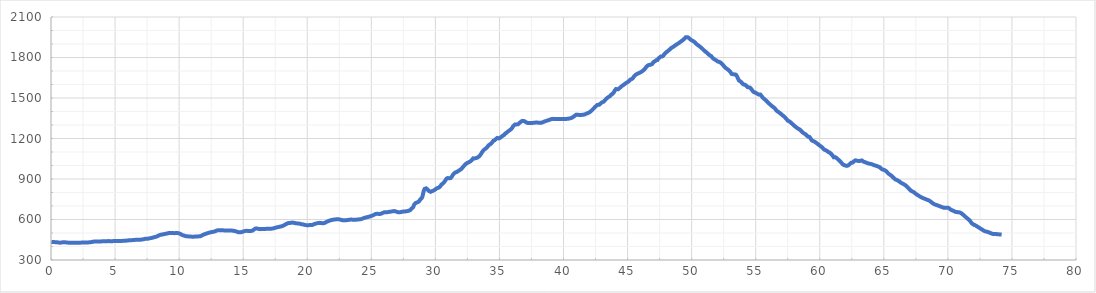
| Category | Alt[m] |
|---|---|
| 0.0 | 435 |
| 0.00437 | 434.59 |
| 0.02919 | 433.57 |
| 0.0406 | 433.1 |
| 0.0711 | 432.4 |
| 0.08312 | 432.28 |
| 0.1089 | 432 |
| 0.11001 | 432.01 |
| 0.12371 | 432.2 |
| 0.13194 | 432.32 |
| 0.15425 | 432.75 |
| 0.1646 | 432.89 |
| 0.1693 | 432.95 |
| 0.18268 | 433 |
| 0.22509 | 432.93 |
| 0.22509 | 432.93 |
| 0.39085000000000003 | 432.01 |
| 0.43028000000000005 | 431.54 |
| 0.47575000000000006 | 431 |
| 0.47575000000000006 | 431 |
| 0.55449 | 429.81 |
| 0.60117 | 429.11 |
| 0.61337 | 428.97 |
| 0.63781 | 428.77 |
| 0.72993 | 428 |
| 0.72993 | 428 |
| 0.99429 | 432.13 |
| 1.01417 | 432.44 |
| 1.04826 | 432.4 |
| 1.16982 | 430.22 |
| 1.21255 | 429.46 |
| 1.2470700000000001 | 429.02 |
| 1.4013200000000001 | 428.18 |
| 1.41809 | 428.09 |
| 1.44148 | 428.02 |
| 1.46187 | 428.01 |
| 1.47576 | 428 |
| 1.47576 | 428 |
| 1.4966899999999999 | 427.96 |
| 1.6485999999999998 | 427.64 |
| 1.7334299999999998 | 427.67 |
| 1.8185999999999998 | 427.81 |
| 1.9037699999999997 | 427.94 |
| 1.9889399999999997 | 428 |
| 2.07989 | 428.03 |
| 2.1708399999999997 | 428.06 |
| 2.2617899999999995 | 428.29 |
| 2.3527399999999994 | 428.78 |
| 2.4358499999999994 | 429.24 |
| 2.5189599999999994 | 429.73 |
| 2.6020699999999994 | 430.03 |
| 2.6851799999999995 | 430.34 |
| 2.7282999999999995 | 430.28 |
| 2.7566299999999995 | 430.15 |
| 2.7811299999999997 | 430.04 |
| 2.7995099999999997 | 430.02 |
| 2.8362 | 430.14 |
| 2.9323099999999998 | 430.44 |
| 3.0013099999999997 | 430.92 |
| 3.0703099999999997 | 431.68 |
| 3.1393099999999996 | 432.44 |
| 3.1659999999999995 | 432.92 |
| 3.1900499999999994 | 433.47 |
| 3.2463899999999994 | 434.75 |
| 3.3027299999999995 | 435.79 |
| 3.3172799999999993 | 435.96 |
| 3.3285199999999993 | 436.1 |
| 3.4129099999999992 | 436.79 |
| 3.4340799999999994 | 436.89 |
| 3.4487499999999995 | 436.96 |
| 3.4914199999999997 | 437 |
| 3.5006099999999996 | 436.99 |
| 3.5173799999999997 | 436.97 |
| 3.53976 | 436.82 |
| 3.5509199999999996 | 436.71 |
| 3.6033699999999995 | 436.18 |
| 3.6179199999999994 | 436.2 |
| 3.634769999999999 | 436.4 |
| 3.659849999999999 | 436.7 |
| 3.7567499999999994 | 437.43 |
| 3.8536499999999996 | 437.69 |
| 3.95055 | 437.95 |
| 4.02746 | 438 |
| 4.104369999999999 | 438 |
| 4.109789999999999 | 438 |
| 4.116249999999999 | 438 |
| 4.124369999999999 | 438 |
| 4.129069999999999 | 437.99 |
| 4.133469999999999 | 437.99 |
| 4.211759999999999 | 438.09 |
| 4.290049999999999 | 438.18 |
| 4.368339999999999 | 438.8 |
| 4.379459999999999 | 438.92 |
| 4.386519999999999 | 439 |
| 4.393249999999999 | 439.09 |
| 4.413449999999999 | 439.35 |
| 4.480849999999999 | 440.21 |
| 4.5482499999999995 | 440.15 |
| 4.610239999999999 | 439.44 |
| 4.67198 | 438.73 |
| 4.72802 | 438.65 |
| 4.78406 | 439.27 |
| 4.84327 | 439.92 |
| 4.902480000000001 | 440.46 |
| 4.995410000000001 | 440.76 |
| 5.0489500000000005 | 440.93 |
| 5.14052 | 441 |
| 5.20572 | 441.02 |
| 5.26318 | 441.04 |
| 5.32064 | 441.13 |
| 5.39968 | 441.27 |
| 5.4888 | 441.44 |
| 5.577920000000001 | 441.61 |
| 5.672470000000001 | 442 |
| 5.7670200000000005 | 442.39 |
| 5.86157 | 443.27 |
| 5.95612 | 444.43 |
| 6.05262 | 445.6 |
| 6.14912 | 446.35 |
| 6.24562 | 446.72 |
| 6.32076 | 447.01 |
| 6.37762 | 447.4 |
| 6.46474 | 448.22 |
| 6.55186 | 449.04 |
| 6.638979999999999 | 449.51 |
| 6.726099999999999 | 449.56 |
| 6.781839999999999 | 449.58 |
| 6.826599999999999 | 449.63 |
| 6.891349999999999 | 449.98 |
| 6.951269999999999 | 450.3 |
| 7.011189999999999 | 450.84 |
| 7.02129 | 450.92 |
| 7.03048 | 450.99 |
| 7.035 | 451 |
| 7.04039 | 451.01 |
| 7.04603 | 451.01 |
| 7.05746 | 451.08 |
| 7.12778 | 451.87 |
| 7.17735 | 452.43 |
| 7.201029999999999 | 452.87 |
| 7.256819999999999 | 454.3 |
| 7.329179999999999 | 456.15 |
| 7.358479999999999 | 456.91 |
| 7.372589999999999 | 457.21 |
| 7.395069999999999 | 457.69 |
| 7.416289999999998 | 457.85 |
| 7.477429999999998 | 457.74 |
| 7.538569999999998 | 457.63 |
| 7.560139999999998 | 457.83 |
| 7.581839999999998 | 458.27 |
| 7.6312599999999975 | 459.28 |
| 7.689469999999997 | 460.4 |
| 7.747679999999997 | 461.44 |
| 7.815479999999997 | 462.65 |
| 7.883279999999997 | 464.19 |
| 7.9510799999999975 | 466.02 |
| 8.035469999999998 | 468.29 |
| 8.11986 | 470.43 |
| 8.20425 | 472.5 |
| 8.21836 | 472.84 |
| 8.235330000000001 | 473.41 |
| 8.24646 | 473.9 |
| 8.268460000000001 | 474.88 |
| 8.29405 | 476.14 |
| 8.35646 | 479.27 |
| 8.36952 | 479.93 |
| 8.4272 | 482.52 |
| 8.480229999999999 | 484.4 |
| 8.533259999999999 | 486.29 |
| 8.595309999999998 | 487.76 |
| 8.677079999999998 | 489.1 |
| 8.758849999999999 | 490.43 |
| 8.84062 | 491.89 |
| 8.92239 | 493.6 |
| 9.00416 | 495.3 |
| 9.08341 | 497.13 |
| 9.16266 | 498.78 |
| 9.24191 | 500.43 |
| 9.30662 | 500.79 |
| 9.37133 | 500.19 |
| 9.39706 | 499.96 |
| 9.45474 | 499.48 |
| 9.51902 | 499.28 |
| 9.58718 | 499.06 |
| 9.65534 | 499 |
| 9.65929 | 499 |
| 9.66698 | 499 |
| 9.67168 | 499.01 |
| 9.683440000000001 | 499.06 |
| 9.694260000000002 | 499.11 |
| 9.790640000000002 | 499.51 |
| 9.887020000000001 | 499.26 |
| 9.929870000000001 | 499.15 |
| 9.983810000000002 | 497.84 |
| 10.037750000000003 | 495.44 |
| 10.126960000000002 | 491.47 |
| 10.169300000000002 | 489.27 |
| 10.214190000000002 | 486.75 |
| 10.279210000000003 | 483.1 |
| 10.293590000000002 | 482.59 |
| 10.318730000000002 | 482.24 |
| 10.372140000000002 | 481.49 |
| 10.404100000000001 | 480.72 |
| 10.441340000000002 | 479.4 |
| 10.530860000000002 | 476.23 |
| 10.539280000000002 | 476.06 |
| 10.550100000000002 | 476.03 |
| 10.573930000000002 | 475.95 |
| 10.645260000000002 | 475.52 |
| 10.716590000000002 | 474.84 |
| 10.787920000000002 | 474.15 |
| 10.812310000000002 | 473.91 |
| 10.829930000000003 | 473.79 |
| 10.896230000000003 | 473.31 |
| 10.962530000000003 | 473.07 |
| 10.985330000000003 | 473.06 |
| 11.078580000000002 | 473 |
| 11.171830000000002 | 473.06 |
| 11.265080000000001 | 473.33 |
| 11.358600000000001 | 473.6 |
| 11.443330000000001 | 474.34 |
| 11.457030000000001 | 474.52 |
| 11.471520000000002 | 474.71 |
| 11.544470000000002 | 475.54 |
| 11.617420000000003 | 476.16 |
| 11.670090000000004 | 476.62 |
| 11.688910000000003 | 477.12 |
| 11.752310000000003 | 480.17 |
| 11.771670000000004 | 481.1 |
| 11.793160000000004 | 482.41 |
| 11.814310000000004 | 483.79 |
| 11.836630000000005 | 485.24 |
| 11.904150000000005 | 488.39 |
| 11.946700000000005 | 489.55 |
| 11.978990000000005 | 490.42 |
| 12.012460000000004 | 491.44 |
| 12.049690000000004 | 493.02 |
| 12.099270000000004 | 495.11 |
| 12.151720000000005 | 497.04 |
| 12.204170000000005 | 498.42 |
| 12.252180000000005 | 499.69 |
| 12.296220000000005 | 500.86 |
| 12.337080000000006 | 502.06 |
| 12.411320000000005 | 504.24 |
| 12.499030000000005 | 506.19 |
| 12.586740000000004 | 507.53 |
| 12.674450000000004 | 508.87 |
| 12.726300000000004 | 509.97 |
| 12.765420000000004 | 511.15 |
| 12.796530000000004 | 512.09 |
| 12.828540000000004 | 513.36 |
| 12.864650000000005 | 515.08 |
| 12.912770000000005 | 517.37 |
| 12.948790000000006 | 518.7 |
| 12.982260000000005 | 519.31 |
| 13.078000000000005 | 521.05 |
| 13.168290000000004 | 521.28 |
| 13.208940000000004 | 520.96 |
| 13.271300000000004 | 520.48 |
| 13.333660000000004 | 520.08 |
| 13.405420000000003 | 519.81 |
| 13.477180000000002 | 519.54 |
| 13.535720000000003 | 519.2 |
| 13.594260000000004 | 518.81 |
| 13.670300000000005 | 518.31 |
| 13.746340000000005 | 518.06 |
| 13.822380000000006 | 518.03 |
| 13.898420000000007 | 518 |
| 13.968560000000007 | 518 |
| 14.054520000000007 | 517.9 |
| 14.140480000000007 | 517.8 |
| 14.209920000000007 | 517.21 |
| 14.228300000000008 | 516.87 |
| 14.261840000000008 | 516.25 |
| 14.277840000000008 | 515.91 |
| 14.352140000000007 | 514.24 |
| 14.426440000000007 | 512.57 |
| 14.500740000000006 | 510.16 |
| 14.578090000000005 | 507.29 |
| 14.617560000000005 | 505.83 |
| 14.670970000000004 | 504.83 |
| 14.724380000000004 | 505.1 |
| 14.811900000000003 | 505.53 |
| 14.899420000000003 | 507.49 |
| 14.948410000000003 | 509.12 |
| 14.986870000000003 | 510.39 |
| 15.069390000000004 | 512.9 |
| 15.151910000000004 | 514.85 |
| 15.181190000000004 | 515.54 |
| 15.210290000000004 | 515.91 |
| 15.233720000000003 | 515.96 |
| 15.251930000000003 | 516 |
| 15.280160000000004 | 515.95 |
| 15.367210000000004 | 515.58 |
| 15.454260000000003 | 515.21 |
| 15.541310000000003 | 514.95 |
| 15.628360000000002 | 515.57 |
| 15.695020000000003 | 516.05 |
| 15.748220000000003 | 518.46 |
| 15.800350000000003 | 522.59 |
| 15.857850000000003 | 527.15 |
| 15.915350000000002 | 531.24 |
| 15.956210000000002 | 533.24 |
| 15.979240000000003 | 534.37 |
| 16.001710000000003 | 534.73 |
| 16.041140000000002 | 534.16 |
| 16.072540000000004 | 533.71 |
| 16.108810000000002 | 532.67 |
| 16.181900000000002 | 530.56 |
| 16.254990000000003 | 528.46 |
| 16.313480000000002 | 528.46 |
| 16.36718 | 529.78 |
| 16.393990000000002 | 530.44 |
| 16.41738 | 530.68 |
| 16.45598 | 530.32 |
| 16.47465 | 530.14 |
| 16.489910000000002 | 530.04 |
| 16.51939 | 530 |
| 16.546380000000003 | 529.96 |
| 16.593350000000004 | 529.89 |
| 16.643660000000004 | 529.94 |
| 16.696220000000004 | 530 |
| 16.773460000000004 | 530.5 |
| 16.850700000000003 | 531.18 |
| 16.927940000000003 | 531.86 |
| 16.953520000000005 | 531.97 |
| 16.986950000000004 | 531.98 |
| 17.072090000000003 | 532 |
| 17.157230000000002 | 532.07 |
| 17.20587 | 532.28 |
| 17.2739 | 532.57 |
| 17.338900000000002 | 533.65 |
| 17.403900000000004 | 535.59 |
| 17.485190000000003 | 538.02 |
| 17.566480000000002 | 540.47 |
| 17.63803 | 542.02 |
| 17.66593 | 542.62 |
| 17.73239 | 543.79 |
| 17.75507 | 544.37 |
| 17.80107 | 545.54 |
| 17.83042 | 546.37 |
| 17.86589 | 547 |
| 17.89642 | 547.55 |
| 17.97496 | 548.96 |
| 18.0535 | 551.63 |
| 18.13204 | 554.31 |
| 18.20002 | 557.84 |
| 18.26109 | 561.39 |
| 18.290309999999998 | 563.09 |
| 18.35652 | 566.6 |
| 18.405359999999998 | 568.91 |
| 18.481209999999997 | 572.5 |
| 18.557059999999996 | 574.59 |
| 18.632909999999995 | 574.77 |
| 18.657079999999997 | 574.82 |
| 18.727369999999997 | 575.16 |
| 18.754529999999995 | 575.76 |
| 18.835489999999997 | 577.53 |
| 18.851219999999998 | 577.6 |
| 18.94813 | 575.52 |
| 19.04504 | 573.44 |
| 19.14195 | 571.62 |
| 19.238860000000003 | 570.77 |
| 19.266740000000002 | 570.52 |
| 19.32084 | 570.3 |
| 19.37494 | 569.74 |
| 19.39531 | 569.53 |
| 19.418049999999997 | 568.91 |
| 19.442019999999996 | 567.99 |
| 19.482209999999995 | 566.44 |
| 19.500279999999997 | 565.95 |
| 19.590369999999997 | 564.53 |
| 19.673079999999995 | 563.23 |
| 19.711129999999994 | 562.48 |
| 19.752909999999993 | 561.45 |
| 19.814269999999993 | 559.94 |
| 19.875629999999994 | 558.49 |
| 19.891799999999993 | 558.25 |
| 19.911809999999992 | 557.96 |
| 19.98538999999999 | 557.71 |
| 20.05896999999999 | 557.97 |
| 20.12306999999999 | 558.2 |
| 20.21475999999999 | 558.78 |
| 20.30644999999999 | 559.4 |
| 20.39813999999999 | 560.01 |
| 20.39948999999999 | 560.04 |
| 20.48316999999999 | 563.31 |
| 20.56684999999999 | 566.58 |
| 20.650529999999993 | 569.16 |
| 20.72459999999999 | 571.05 |
| 20.79866999999999 | 572.93 |
| 20.87273999999999 | 574.57 |
| 20.93366999999999 | 575.06 |
| 20.955929999999988 | 575.24 |
| 21.040289999999988 | 574.42 |
| 21.12464999999999 | 573.36 |
| 21.20900999999999 | 572.29 |
| 21.29336999999999 | 573.01 |
| 21.37772999999999 | 575.75 |
| 21.39251999999999 | 576.23 |
| 21.409369999999992 | 577.05 |
| 21.42204999999999 | 577.76 |
| 21.477009999999993 | 580.84 |
| 21.531969999999994 | 583.65 |
| 21.551419999999993 | 584.47 |
| 21.582359999999994 | 585.78 |
| 21.620239999999995 | 587.21 |
| 21.672959999999996 | 589.27 |
| 21.703309999999995 | 590.45 |
| 21.770539999999993 | 592.84 |
| 21.837769999999992 | 594.64 |
| 21.90499999999999 | 596.45 |
| 21.94677999999999 | 597.25 |
| 21.972159999999988 | 597.66 |
| 21.99908999999999 | 598.09 |
| 22.08284999999999 | 599.34 |
| 22.16660999999999 | 600.36 |
| 22.250369999999993 | 601.38 |
| 22.278369999999992 | 601.67 |
| 22.296199999999992 | 601.75 |
| 22.37467999999999 | 602.13 |
| 22.45315999999999 | 601.52 |
| 22.53163999999999 | 600.06 |
| 22.59288999999999 | 598.92 |
| 22.64443999999999 | 597.6 |
| 22.68906999999999 | 596.29 |
| 22.75364999999999 | 594.39 |
| 22.76860999999999 | 594.23 |
| 22.788979999999988 | 594.38 |
| 22.826149999999988 | 594.66 |
| 22.881799999999988 | 594.91 |
| 22.962639999999986 | 595.01 |
| 23.043479999999985 | 595.1 |
| 23.129589999999986 | 595.55 |
| 23.143659999999986 | 595.76 |
| 23.181379999999987 | 596.31 |
| 23.198399999999985 | 596.67 |
| 23.265489999999986 | 597.91 |
| 23.332579999999986 | 599.14 |
| 23.398689999999984 | 599.55 |
| 23.464799999999983 | 599.2 |
| 23.483149999999984 | 599.1 |
| 23.498419999999985 | 598.99 |
| 23.517539999999986 | 598.88 |
| 23.591439999999984 | 598.44 |
| 23.665339999999983 | 598.26 |
| 23.73923999999998 | 598.51 |
| 23.812679999999983 | 598.76 |
| 23.876869999999982 | 599.15 |
| 23.96097999999998 | 599.73 |
| 23.992589999999982 | 599.95 |
| 24.02941999999998 | 600.33 |
| 24.10774999999998 | 601.52 |
| 24.186079999999983 | 602.71 |
| 24.264409999999984 | 604.74 |
| 24.342739999999985 | 607.68 |
| 24.441899999999986 | 611.4 |
| 24.520479999999985 | 613.93 |
| 24.599059999999984 | 615.68 |
| 24.696869999999983 | 617.85 |
| 24.794679999999982 | 620.07 |
| 24.89248999999998 | 622.74 |
| 24.948859999999982 | 624.28 |
| 25.002779999999984 | 626.01 |
| 25.065969999999982 | 628.45 |
| 25.12915999999998 | 630.9 |
| 25.224849999999982 | 635.47 |
| 25.269329999999982 | 637.69 |
| 25.33569999999998 | 641.01 |
| 25.387579999999982 | 642.22 |
| 25.439459999999983 | 642.02 |
| 25.53511999999998 | 641.66 |
| 25.63077999999998 | 641.23 |
| 25.67749999999998 | 641.47 |
| 25.72342999999998 | 641.71 |
| 25.77026999999998 | 643.01 |
| 25.812799999999978 | 645.07 |
| 25.848079999999978 | 646.78 |
| 25.88888999999998 | 648.77 |
| 25.940819999999977 | 650.72 |
| 26.021159999999977 | 653.75 |
| 26.081329999999976 | 654.49 |
| 26.141499999999976 | 654.02 |
| 26.193419999999975 | 653.62 |
| 26.232519999999976 | 653.8 |
| 26.264939999999974 | 654.47 |
| 26.284709999999976 | 654.88 |
| 26.295939999999977 | 655.12 |
| 26.317959999999978 | 655.57 |
| 26.339389999999977 | 656.01 |
| 26.375659999999975 | 656.56 |
| 26.403659999999974 | 656.78 |
| 26.431109999999975 | 657 |
| 26.449459999999977 | 657.16 |
| 26.471029999999978 | 657.46 |
| 26.522279999999977 | 658.17 |
| 26.573529999999977 | 659.12 |
| 26.604529999999976 | 659.77 |
| 26.656389999999977 | 660.85 |
| 26.70824999999998 | 661.73 |
| 26.722929999999977 | 661.84 |
| 26.80114999999998 | 662.41 |
| 26.85322999999998 | 661.58 |
| 26.926159999999978 | 658.98 |
| 26.999379999999977 | 656.38 |
| 27.072599999999976 | 654.3 |
| 27.145819999999976 | 653.44 |
| 27.163879999999974 | 653.23 |
| 27.204759999999975 | 653.47 |
| 27.291669999999975 | 655 |
| 27.378579999999975 | 656.54 |
| 27.432489999999973 | 657.64 |
| 27.473549999999975 | 658.43 |
| 27.492499999999975 | 658.79 |
| 27.510549999999974 | 658.93 |
| 27.529589999999974 | 658.88 |
| 27.545439999999974 | 658.85 |
| 27.591369999999973 | 659.07 |
| 27.687289999999972 | 660.41 |
| 27.783209999999972 | 661.76 |
| 27.81044999999997 | 662.22 |
| 27.82807999999997 | 662.59 |
| 27.858739999999973 | 663.24 |
| 27.882029999999972 | 663.87 |
| 27.955599999999972 | 666.47 |
| 28.029169999999972 | 669.08 |
| 28.06214999999997 | 671.6 |
| 28.15648999999997 | 682.54 |
| 28.16789999999997 | 683.87 |
| 28.181569999999972 | 685.04 |
| 28.190389999999972 | 685.42 |
| 28.199829999999974 | 685.82 |
| 28.210109999999975 | 686.16 |
| 28.220129999999976 | 686.58 |
| 28.229809999999976 | 686.98 |
| 28.242389999999975 | 688.13 |
| 28.270659999999975 | 692.41 |
| 28.277859999999976 | 693.5 |
| 28.286889999999975 | 695.57 |
| 28.293739999999975 | 697.66 |
| 28.301439999999975 | 700.01 |
| 28.307209999999973 | 701.79 |
| 28.313389999999973 | 703.42 |
| 28.321689999999972 | 705.6 |
| 28.36376999999997 | 713.12 |
| 28.38328999999997 | 715.07 |
| 28.43830999999997 | 720.57 |
| 28.49332999999997 | 723.47 |
| 28.529309999999967 | 724.65 |
| 28.59007999999997 | 726.65 |
| 28.65084999999997 | 729.36 |
| 28.70191999999997 | 733.14 |
| 28.73159999999997 | 735.33 |
| 28.749559999999967 | 737.36 |
| 28.759239999999966 | 738.78 |
| 28.767329999999966 | 739.97 |
| 28.831669999999967 | 749.9 |
| 28.854929999999968 | 753.14 |
| 28.862629999999967 | 754.22 |
| 28.871299999999966 | 754.87 |
| 28.879239999999967 | 755.14 |
| 28.918269999999968 | 756.46 |
| 28.94834999999997 | 759.84 |
| 28.97678999999997 | 766.86 |
| 28.986199999999968 | 769.18 |
| 29.01452999999997 | 779.82 |
| 29.02586999999997 | 784.44 |
| 29.08973999999997 | 810.45 |
| 29.15731999999997 | 826.51 |
| 29.22337999999997 | 828.67 |
| 29.285839999999972 | 830.72 |
| 29.347009999999973 | 826.56 |
| 29.39639999999997 | 821.43 |
| 29.45009999999997 | 815.85 |
| 29.52144999999997 | 809.64 |
| 29.59279999999997 | 806.4 |
| 29.62494999999997 | 804.94 |
| 29.67256999999997 | 805.84 |
| 29.74125999999997 | 810.43 |
| 29.751149999999967 | 811.09 |
| 29.759809999999966 | 811.55 |
| 29.768349999999966 | 811.75 |
| 29.776709999999966 | 811.94 |
| 29.811409999999967 | 812.55 |
| 29.850989999999967 | 813.62 |
| 29.882349999999967 | 814.46 |
| 29.889199999999967 | 814.83 |
| 29.923719999999967 | 817.57 |
| 29.98748999999997 | 822.62 |
| 30.04426999999997 | 826.87 |
| 30.09725999999997 | 830.25 |
| 30.10504999999997 | 830.75 |
| 30.11407999999997 | 831.21 |
| 30.11951999999997 | 831.43 |
| 30.12645999999997 | 831.71 |
| 30.16208999999997 | 832.94 |
| 30.17332999999997 | 833.31 |
| 30.203259999999972 | 834.31 |
| 30.216929999999973 | 834.85 |
| 30.230409999999974 | 835.42 |
| 30.262449999999973 | 836.76 |
| 30.270539999999972 | 836.95 |
| 30.28021999999997 | 836.97 |
| 30.29034999999997 | 837 |
| 30.310519999999972 | 837 |
| 30.31945999999997 | 837.13 |
| 30.335929999999973 | 837.36 |
| 30.348619999999972 | 838.6 |
| 30.411569999999973 | 849.64 |
| 30.424789999999973 | 851.96 |
| 30.441669999999974 | 855.04 |
| 30.449289999999973 | 856.29 |
| 30.460519999999974 | 858.12 |
| 30.469709999999974 | 859.06 |
| 30.481979999999975 | 859.82 |
| 30.576259999999976 | 865.63 |
| 30.618449999999978 | 869.27 |
| 30.663619999999977 | 874.5 |
| 30.756719999999977 | 885.27 |
| 30.773439999999976 | 887.77 |
| 30.786059999999974 | 890.04 |
| 30.796849999999974 | 891.99 |
| 30.808859999999974 | 894.26 |
| 30.821979999999975 | 896.74 |
| 30.831459999999975 | 898.53 |
| 30.844939999999976 | 900.54 |
| 30.870579999999975 | 902.79 |
| 30.887919999999976 | 904.31 |
| 30.961749999999977 | 906.79 |
| 30.99285999999998 | 906.62 |
| 31.08210999999998 | 906.12 |
| 31.099879999999978 | 905.66 |
| 31.12329999999998 | 904.92 |
| 31.13930999999998 | 904.41 |
| 31.15054999999998 | 904.53 |
| 31.18840999999998 | 906.63 |
| 31.19887999999998 | 907.21 |
| 31.210109999999982 | 908.01 |
| 31.221419999999984 | 908.98 |
| 31.233039999999985 | 909.98 |
| 31.249169999999985 | 911.82 |
| 31.276179999999986 | 915.78 |
| 31.286229999999986 | 917.25 |
| 31.296599999999987 | 919.06 |
| 31.312479999999987 | 922.05 |
| 31.327649999999988 | 924.91 |
| 31.35153999999999 | 928.72 |
| 31.38961999999999 | 933.61 |
| 31.41006999999999 | 936.23 |
| 31.42275999999999 | 937.67 |
| 31.43347999999999 | 938.75 |
| 31.45474999999999 | 940.91 |
| 31.46590999999999 | 941.85 |
| 31.50141999999999 | 944.3 |
| 31.588249999999988 | 950.3 |
| 31.602369999999986 | 950.83 |
| 31.622139999999987 | 950.94 |
| 31.640199999999986 | 951.05 |
| 31.651739999999986 | 951.18 |
| 31.679579999999987 | 952.02 |
| 31.686429999999987 | 952.22 |
| 31.724289999999986 | 954.39 |
| 31.812609999999985 | 961.38 |
| 31.832489999999986 | 962.95 |
| 31.851859999999984 | 964.16 |
| 31.934479999999983 | 967.77 |
| 31.955489999999983 | 968.68 |
| 31.987639999999985 | 970.71 |
| 32.03566999999998 | 975.08 |
| 32.04914999999998 | 976.3 |
| 32.06640999999998 | 978.3 |
| 32.07678999999998 | 979.67 |
| 32.121839999999985 | 985.64 |
| 32.14065999999998 | 987.88 |
| 32.17301999999998 | 991.1 |
| 32.184559999999976 | 992.25 |
| 32.237319999999976 | 997.53 |
| 32.290079999999975 | 1003.46 |
| 32.32493999999998 | 1007.38 |
| 32.33647999999997 | 1008.92 |
| 32.341189999999976 | 1009.59 |
| 32.35074999999998 | 1010.95 |
| 32.35692999999998 | 1011.57 |
| 32.364849999999976 | 1012.04 |
| 32.42657999999997 | 1015.72 |
| 32.48830999999997 | 1018.87 |
| 32.57964999999997 | 1023.06 |
| 32.670989999999975 | 1027.24 |
| 32.70826999999998 | 1029.26 |
| 32.744659999999975 | 1031.91 |
| 32.810879999999976 | 1036.74 |
| 32.85420999999997 | 1041.23 |
| 32.868679999999976 | 1042.99 |
| 32.94855999999998 | 1052.7 |
| 32.961309999999976 | 1053.3 |
| 32.97657999999998 | 1052.99 |
| 33.03043999999998 | 1051.9 |
| 33.08429999999998 | 1052.33 |
| 33.12906999999998 | 1053.8 |
| 33.15065999999998 | 1054.51 |
| 33.22902999999998 | 1056.77 |
| 33.24284999999998 | 1057.11 |
| 33.25672999999998 | 1057.45 |
| 33.272579999999984 | 1058.12 |
| 33.301819999999985 | 1059.9 |
| 33.320179999999986 | 1061.02 |
| 33.36602999999999 | 1063.95 |
| 33.37824999999999 | 1064.79 |
| 33.384529999999984 | 1065.23 |
| 33.39355999999999 | 1065.95 |
| 33.39917999999999 | 1066.44 |
| 33.404949999999985 | 1066.94 |
| 33.471609999999984 | 1073.38 |
| 33.496189999999984 | 1076.4 |
| 33.54824999999998 | 1082.81 |
| 33.59411999999998 | 1090.09 |
| 33.623359999999984 | 1095.28 |
| 33.64203999999999 | 1098.59 |
| 33.660859999999985 | 1101.48 |
| 33.736389999999986 | 1110.7 |
| 33.75839999999999 | 1113.39 |
| 33.80314999999999 | 1117.53 |
| 33.83683999999999 | 1119.65 |
| 33.91082999999999 | 1124.3 |
| 33.93550999999999 | 1125.75 |
| 33.96069999999999 | 1127.7 |
| 33.97876999999999 | 1129.09 |
| 34.03761999999999 | 1135.08 |
| 34.04573999999999 | 1136.03 |
| 34.05382999999999 | 1136.97 |
| 34.06354999999999 | 1138.21 |
| 34.06972999999999 | 1138.97 |
| 34.15100999999999 | 1149.07 |
| 34.181569999999994 | 1151.74 |
| 34.253339999999994 | 1156.13 |
| 34.347289999999994 | 1161.87 |
| 34.392269999999996 | 1166.19 |
| 34.43749999999999 | 1171.9 |
| 34.53278999999999 | 1183.94 |
| 34.55042999999999 | 1185.31 |
| 34.56616999999999 | 1185.6 |
| 34.58691999999999 | 1185.98 |
| 34.608999999999995 | 1186.41 |
| 34.6335 | 1187.57 |
| 34.66052 | 1188.85 |
| 34.68282 | 1191.12 |
| 34.72413 | 1196.46 |
| 34.743140000000004 | 1198.91 |
| 34.788230000000006 | 1202.76 |
| 34.83003000000001 | 1204.27 |
| 34.855230000000006 | 1205.18 |
| 34.865280000000006 | 1205.02 |
| 34.87431000000001 | 1204.43 |
| 34.88372000000001 | 1203.82 |
| 34.89526000000001 | 1202.8 |
| 34.91518000000001 | 1200.8 |
| 34.92203000000001 | 1200.11 |
| 34.92982000000001 | 1199.81 |
| 34.94330000000001 | 1200.32 |
| 35.01807000000001 | 1203.12 |
| 35.10301000000001 | 1208.92 |
| 35.186290000000014 | 1215.47 |
| 35.219000000000015 | 1218.05 |
| 35.28024000000001 | 1221.7 |
| 35.331440000000015 | 1224.19 |
| 35.357210000000016 | 1225.45 |
| 35.37737000000001 | 1227.31 |
| 35.41743000000001 | 1232.65 |
| 35.43291000000001 | 1234.71 |
| 35.45336 | 1236.75 |
| 35.48239 | 1238.35 |
| 35.495870000000004 | 1239.09 |
| 35.52293 | 1240.53 |
| 35.53701 | 1241.53 |
| 35.564750000000004 | 1243.5 |
| 35.591390000000004 | 1245.79 |
| 35.621050000000004 | 1248.37 |
| 35.67539000000001 | 1253.11 |
| 35.702220000000004 | 1254.95 |
| 35.73272000000001 | 1256.73 |
| 35.75151000000001 | 1257.83 |
| 35.79649000000001 | 1260.8 |
| 35.83073000000001 | 1263.14 |
| 35.85880000000001 | 1265.06 |
| 35.91657000000001 | 1269.84 |
| 35.938320000000004 | 1272.37 |
| 35.98856000000001 | 1278.22 |
| 36.01603000000001 | 1282.24 |
| 36.083400000000005 | 1292.5 |
| 36.09335000000001 | 1294.01 |
| 36.110980000000005 | 1296.09 |
| 36.130610000000004 | 1297.58 |
| 36.211000000000006 | 1303.66 |
| 36.27033000000001 | 1305.13 |
| 36.32966000000001 | 1304.4 |
| 36.40487000000001 | 1303.47 |
| 36.45492000000001 | 1305.25 |
| 36.50497000000001 | 1309.89 |
| 36.55268000000001 | 1314.31 |
| 36.58719000000001 | 1317.43 |
| 36.63055000000001 | 1320.74 |
| 36.70673000000001 | 1326.56 |
| 36.72879000000001 | 1327.98 |
| 36.74959000000001 | 1328.87 |
| 36.78569000000001 | 1330.42 |
| 36.82679000000001 | 1330.79 |
| 36.91874000000001 | 1329.08 |
| 36.94023000000001 | 1328.68 |
| 36.96611000000001 | 1327.72 |
| 36.983740000000004 | 1326.65 |
| 37.001050000000006 | 1325.6 |
| 37.087 | 1319.31 |
| 37.119020000000006 | 1317.51 |
| 37.13608000000001 | 1316.55 |
| 37.229110000000006 | 1314.58 |
| 37.294410000000006 | 1314.92 |
| 37.311020000000006 | 1315 |
| 37.34745000000001 | 1315.3 |
| 37.367700000000006 | 1315.25 |
| 37.38523000000001 | 1315.21 |
| 37.460750000000004 | 1314.98 |
| 37.50972 | 1315.13 |
| 37.539 | 1315.22 |
| 37.60161 | 1315.58 |
| 37.62863 | 1315.81 |
| 37.68312 | 1316.27 |
| 37.72415 | 1316.79 |
| 37.76446 | 1317.34 |
| 37.81864 | 1318.09 |
| 37.86743 | 1318.47 |
| 37.95711 | 1318.38 |
| 37.98603 | 1318.35 |
| 38.01846 | 1317.8 |
| 38.07335 | 1316.28 |
| 38.103939999999994 | 1315.43 |
| 38.145059999999994 | 1315.05 |
| 38.19046999999999 | 1315.71 |
| 38.27575999999999 | 1316.94 |
| 38.36104999999999 | 1319.5 |
| 38.44633999999999 | 1322.97 |
| 38.53162999999999 | 1326.43 |
| 38.59575999999999 | 1328.79 |
| 38.65988999999999 | 1330.69 |
| 38.74217999999999 | 1333.14 |
| 38.82446999999999 | 1335.7 |
| 38.90675999999999 | 1338.53 |
| 38.98904999999999 | 1341.37 |
| 39.07133999999999 | 1344.04 |
| 39.08333999999999 | 1344.31 |
| 39.10162999999999 | 1344.73 |
| 39.189519999999995 | 1345.46 |
| 39.277409999999996 | 1345.2 |
| 39.3653 | 1344.94 |
| 39.45319 | 1344.5 |
| 39.54108 | 1344.3 |
| 39.62897 | 1344.11 |
| 39.716860000000004 | 1344.11 |
| 39.804750000000006 | 1344.11 |
| 39.89976000000001 | 1344.11 |
| 39.99477000000001 | 1344.17 |
| 40.08978000000001 | 1344.52 |
| 40.184790000000014 | 1344.87 |
| 40.267350000000015 | 1345.57 |
| 40.349910000000015 | 1346.56 |
| 40.432470000000016 | 1347.56 |
| 40.51503000000002 | 1349.19 |
| 40.59546000000002 | 1352.11 |
| 40.67589000000002 | 1355.02 |
| 40.75632000000002 | 1359.87 |
| 40.77088000000002 | 1360.96 |
| 40.79489000000002 | 1362.75 |
| 40.86566000000002 | 1367.78 |
| 40.93563000000002 | 1372.22 |
| 41.005600000000015 | 1376.67 |
| 41.03019000000002 | 1377.19 |
| 41.129730000000016 | 1375.79 |
| 41.229270000000014 | 1374.39 |
| 41.32881000000001 | 1374.16 |
| 41.42835000000001 | 1374.84 |
| 41.45497000000001 | 1375.02 |
| 41.48821000000001 | 1375.34 |
| 41.57283000000001 | 1376.69 |
| 41.65745000000001 | 1378.03 |
| 41.69093000000001 | 1379.26 |
| 41.72234000000001 | 1380.98 |
| 41.772540000000006 | 1383.73 |
| 41.82274 | 1385.84 |
| 41.88087 | 1387.3 |
| 41.90751 | 1387.97 |
| 41.93143 | 1388.88 |
| 41.97546 | 1391.56 |
| 42.07526 | 1397.64 |
| 42.17506 | 1405.56 |
| 42.274860000000004 | 1415.09 |
| 42.374660000000006 | 1424.63 |
| 42.47446000000001 | 1434.47 |
| 42.48722000000001 | 1435.57 |
| 42.51373000000001 | 1437.85 |
| 42.54014000000001 | 1440.1 |
| 42.554930000000006 | 1441.53 |
| 42.618840000000006 | 1447.71 |
| 42.635810000000006 | 1448.63 |
| 42.71318000000001 | 1449.46 |
| 42.79055000000001 | 1450.28 |
| 42.82880000000001 | 1451.27 |
| 42.83466000000001 | 1451.64 |
| 42.84438000000001 | 1452.25 |
| 42.85386000000001 | 1453.27 |
| 42.858860000000014 | 1453.95 |
| 42.86554000000002 | 1454.87 |
| 42.90664000000002 | 1460.37 |
| 42.92111000000002 | 1461.88 |
| 42.94810000000002 | 1464.7 |
| 42.981290000000016 | 1466.83 |
| 42.99375000000001 | 1467.27 |
| 43.008400000000016 | 1467.79 |
| 43.02748000000002 | 1468.35 |
| 43.03200000000002 | 1468.52 |
| 43.04054000000002 | 1468.83 |
| 43.04748000000002 | 1469.1 |
| 43.056960000000025 | 1469.44 |
| 43.067680000000024 | 1469.82 |
| 43.11453000000002 | 1471.75 |
| 43.12932000000002 | 1472.79 |
| 43.14004000000002 | 1473.55 |
| 43.196350000000024 | 1479.24 |
| 43.25266000000003 | 1485.49 |
| 43.26731000000003 | 1487.11 |
| 43.30856000000003 | 1491.52 |
| 43.32715000000003 | 1493.2 |
| 43.36718000000003 | 1496.82 |
| 43.44261000000003 | 1502.51 |
| 43.45835000000003 | 1503.64 |
| 43.48989000000003 | 1505.89 |
| 43.515510000000035 | 1507.49 |
| 43.547230000000035 | 1509.22 |
| 43.62271000000003 | 1513.32 |
| 43.64397000000003 | 1515.18 |
| 43.68418000000003 | 1520.09 |
| 43.70371000000004 | 1522.47 |
| 43.722620000000035 | 1524.3 |
| 43.785680000000035 | 1528.45 |
| 43.80815000000003 | 1529.93 |
| 43.83273000000003 | 1531.8 |
| 43.89074000000004 | 1537.17 |
| 43.90960000000003 | 1538.92 |
| 43.923280000000034 | 1540.58 |
| 43.936830000000036 | 1542.92 |
| 43.950280000000035 | 1545.25 |
| 43.99231000000003 | 1554.33 |
| 43.99788000000003 | 1555.57 |
| 44.00259000000003 | 1556.62 |
| 44.01207000000004 | 1558.15 |
| 44.02278000000004 | 1559.2 |
| 44.09797000000004 | 1566.56 |
| 44.11079000000004 | 1566.97 |
| 44.12534000000004 | 1566.53 |
| 44.182130000000036 | 1564.82 |
| 44.19416000000004 | 1564.61 |
| 44.20905000000004 | 1564.74 |
| 44.26873000000004 | 1565.24 |
| 44.28281000000004 | 1566.03 |
| 44.29563000000004 | 1567.18 |
| 44.317000000000036 | 1569.08 |
| 44.37769000000004 | 1573.72 |
| 44.43838000000004 | 1578.22 |
| 44.452410000000036 | 1579.26 |
| 44.483950000000036 | 1582.28 |
| 44.489970000000035 | 1582.98 |
| 44.495590000000036 | 1583.64 |
| 44.500980000000034 | 1584.2 |
| 44.513920000000034 | 1585.26 |
| 44.571650000000034 | 1590.02 |
| 44.59146000000003 | 1591.31 |
| 44.641830000000034 | 1594 |
| 44.65124000000004 | 1594.51 |
| 44.673620000000035 | 1595.91 |
| 44.68187000000003 | 1596.47 |
| 44.68720000000003 | 1596.83 |
| 44.69286000000003 | 1597.21 |
| 44.69738000000003 | 1597.56 |
| 44.70295000000003 | 1597.98 |
| 44.72601000000003 | 1599.85 |
| 44.73520000000003 | 1600.57 |
| 44.79088000000003 | 1604.9 |
| 44.80553000000003 | 1605.92 |
| 44.85623000000003 | 1609.06 |
| 44.88503000000003 | 1610.85 |
| 44.88955000000003 | 1611.14 |
| 44.89589000000003 | 1611.58 |
| 44.90455000000003 | 1612.17 |
| 44.91217000000003 | 1612.65 |
| 44.936200000000035 | 1613.89 |
| 44.987460000000034 | 1616.53 |
| 45.009560000000036 | 1617.81 |
| 45.06889000000004 | 1621.91 |
| 45.09224000000004 | 1623.52 |
| 45.10752000000004 | 1624.82 |
| 45.143670000000036 | 1628.39 |
| 45.160390000000035 | 1630.04 |
| 45.17052000000003 | 1631.09 |
| 45.17614000000003 | 1631.7 |
| 45.205180000000034 | 1634.85 |
| 45.21694000000004 | 1636.06 |
| 45.233790000000035 | 1637.58 |
| 45.244070000000036 | 1638.51 |
| 45.25274000000004 | 1638.99 |
| 45.25912000000004 | 1639.14 |
| 45.28803000000004 | 1639.83 |
| 45.29926000000004 | 1640.04 |
| 45.30397000000004 | 1640.16 |
| 45.32740000000004 | 1640.79 |
| 45.35009000000004 | 1641.97 |
| 45.360810000000036 | 1642.75 |
| 45.39422000000004 | 1645.19 |
| 45.405760000000036 | 1646.39 |
| 45.418450000000036 | 1648.1 |
| 45.46045000000004 | 1653.77 |
| 45.529170000000036 | 1662.63 |
| 45.59201000000004 | 1668.79 |
| 45.60874000000004 | 1670.43 |
| 45.69936000000004 | 1676.16 |
| 45.788420000000045 | 1680.28 |
| 45.850700000000046 | 1683.16 |
| 45.866120000000045 | 1683.81 |
| 45.96031000000004 | 1687.72 |
| 45.97289000000004 | 1688.25 |
| 46.01504000000004 | 1690.28 |
| 46.03310000000004 | 1691.37 |
| 46.04757000000004 | 1692.24 |
| 46.09726000000004 | 1695.47 |
| 46.16515000000004 | 1699.73 |
| 46.18823000000004 | 1701.18 |
| 46.19946000000004 | 1701.84 |
| 46.20708000000004 | 1702.26 |
| 46.217970000000044 | 1702.85 |
| 46.227400000000046 | 1703.53 |
| 46.23974000000005 | 1704.7 |
| 46.28028000000005 | 1708.57 |
| 46.299750000000046 | 1710.62 |
| 46.31417000000005 | 1712.16 |
| 46.33782000000005 | 1714.68 |
| 46.35454000000005 | 1716.56 |
| 46.44327000000005 | 1727.51 |
| 46.46396000000005 | 1730.07 |
| 46.51216000000005 | 1735.4 |
| 46.57904000000005 | 1740.58 |
| 46.60518000000005 | 1742.6 |
| 46.658430000000045 | 1744.66 |
| 46.700760000000045 | 1745.26 |
| 46.77344000000004 | 1746.3 |
| 46.80247000000004 | 1746.66 |
| 46.83709000000004 | 1747.65 |
| 46.84943000000004 | 1748 |
| 46.91740000000004 | 1751.59 |
| 46.92745000000004 | 1752.43 |
| 46.93685000000004 | 1753.21 |
| 46.94405000000004 | 1754.16 |
| 46.95184000000004 | 1755.41 |
| 46.99948000000004 | 1763.02 |
| 47.00950000000004 | 1764.28 |
| 47.055470000000035 | 1768.31 |
| 47.06356000000004 | 1769.01 |
| 47.07352000000004 | 1769.63 |
| 47.07860000000004 | 1769.8 |
| 47.08462000000004 | 1769.99 |
| 47.092450000000035 | 1770.24 |
| 47.12181000000003 | 1771.64 |
| 47.136300000000034 | 1772.34 |
| 47.14802000000003 | 1773.17 |
| 47.161910000000034 | 1774.32 |
| 47.174290000000035 | 1775.35 |
| 47.24596000000003 | 1780.37 |
| 47.253890000000034 | 1780.71 |
| 47.25955000000003 | 1780.95 |
| 47.264550000000035 | 1781 |
| 47.27571000000003 | 1781 |
| 47.28110000000003 | 1781 |
| 47.28941000000003 | 1781.03 |
| 47.300120000000035 | 1781.2 |
| 47.333970000000036 | 1781.72 |
| 47.34242000000004 | 1782.46 |
| 47.35501000000004 | 1784.51 |
| 47.36338000000004 | 1785.88 |
| 47.37565000000004 | 1787.94 |
| 47.404710000000044 | 1792.54 |
| 47.41280000000005 | 1793.82 |
| 47.41974000000005 | 1794.61 |
| 47.42988000000005 | 1795.36 |
| 47.523490000000045 | 1802.25 |
| 47.58701000000004 | 1806.85 |
| 47.60379000000004 | 1807.94 |
| 47.61718000000004 | 1808.81 |
| 47.631070000000044 | 1809.09 |
| 47.67411000000004 | 1808.15 |
| 47.68096000000004 | 1808.01 |
| 47.70212000000004 | 1807.83 |
| 47.71049000000004 | 1808.04 |
| 47.75333000000004 | 1809.08 |
| 47.76656000000004 | 1810.19 |
| 47.79537000000004 | 1814.16 |
| 47.80103000000004 | 1814.94 |
| 47.80940000000004 | 1816.21 |
| 47.81517000000004 | 1817.14 |
| 47.81969000000004 | 1817.86 |
| 47.826890000000034 | 1818.98 |
| 47.83774000000003 | 1820.53 |
| 47.85448000000003 | 1822.93 |
| 47.862100000000034 | 1823.87 |
| 47.90910000000003 | 1828.6 |
| 47.96069000000003 | 1833.8 |
| 48.012280000000025 | 1838.14 |
| 48.09816000000003 | 1844.54 |
| 48.18404000000003 | 1850.93 |
| 48.269920000000035 | 1857.91 |
| 48.35580000000004 | 1865.46 |
| 48.429130000000036 | 1871.91 |
| 48.43957000000004 | 1872.61 |
| 48.445760000000035 | 1872.83 |
| 48.450820000000036 | 1873 |
| 48.456840000000035 | 1873.22 |
| 48.46712000000004 | 1873.74 |
| 48.512310000000035 | 1876.01 |
| 48.53254000000003 | 1877.16 |
| 48.62691000000003 | 1883.04 |
| 48.645590000000034 | 1884.21 |
| 48.672570000000036 | 1886.06 |
| 48.72731000000004 | 1890.17 |
| 48.78205000000004 | 1894.27 |
| 48.78767000000004 | 1894.66 |
| 48.79237000000004 | 1894.93 |
| 48.79743000000004 | 1895.23 |
| 48.80885000000004 | 1895.88 |
| 48.839970000000044 | 1897.59 |
| 48.85762000000005 | 1898.56 |
| 48.95417000000005 | 1903.78 |
| 48.97114000000005 | 1904.89 |
| 48.99107000000005 | 1906.18 |
| 49.03601000000005 | 1909.51 |
| 49.10089000000005 | 1914.14 |
| 49.16972000000005 | 1919.05 |
| 49.26413000000005 | 1925.55 |
| 49.358540000000055 | 1932.54 |
| 49.39285000000005 | 1935.08 |
| 49.46069000000005 | 1941.54 |
| 49.47822000000005 | 1943.54 |
| 49.52292000000005 | 1948.62 |
| 49.54273000000005 | 1950.56 |
| 49.56433000000005 | 1951.96 |
| 49.587200000000045 | 1953.45 |
| 49.60859000000004 | 1953.61 |
| 49.67666000000004 | 1950.64 |
| 49.73718000000004 | 1947.99 |
| 49.770080000000036 | 1945.64 |
| 49.793160000000036 | 1943.48 |
| 49.838940000000036 | 1939.2 |
| 49.88050000000003 | 1935.61 |
| 49.92260000000003 | 1932.56 |
| 49.95355000000003 | 1930.32 |
| 49.97553000000003 | 1929.04 |
| 50.01854000000003 | 1926.92 |
| 50.07928000000003 | 1923.92 |
| 50.140020000000035 | 1920.49 |
| 50.168470000000035 | 1918.38 |
| 50.24717000000003 | 1912.56 |
| 50.29872000000003 | 1907.41 |
| 50.31788000000003 | 1905.35 |
| 50.35747000000003 | 1901.1 |
| 50.41811000000003 | 1896.08 |
| 50.46463000000003 | 1893.34 |
| 50.486200000000025 | 1892.07 |
| 50.51213000000003 | 1890.52 |
| 50.55876000000003 | 1887.2 |
| 50.621410000000026 | 1882.73 |
| 50.680860000000024 | 1878.05 |
| 50.73930000000002 | 1873.16 |
| 50.80045000000002 | 1868.05 |
| 50.88282000000002 | 1860.71 |
| 50.965190000000014 | 1853.2 |
| 51.04756000000001 | 1845.69 |
| 51.076020000000014 | 1843.59 |
| 51.10435000000001 | 1841.69 |
| 51.14925000000001 | 1838.68 |
| 51.21394000000001 | 1833.25 |
| 51.27863000000001 | 1827.33 |
| 51.294810000000005 | 1825.85 |
| 51.31616 | 1823.87 |
| 51.35094 | 1820.82 |
| 51.3645 | 1819.64 |
| 51.44371 | 1814.47 |
| 51.491310000000006 | 1812.42 |
| 51.51681000000001 | 1811.33 |
| 51.53343000000001 | 1810.08 |
| 51.55284000000001 | 1807.64 |
| 51.57294000000001 | 1805.13 |
| 51.58213000000001 | 1803.86 |
| 51.589330000000004 | 1802.89 |
| 51.600880000000004 | 1801.35 |
| 51.62675 | 1798.39 |
| 51.64439 | 1796.76 |
| 51.69771 | 1791.84 |
| 51.75407 | 1787.91 |
| 51.85041 | 1782.61 |
| 51.946749999999994 | 1777.32 |
| 51.96809 | 1775.8 |
| 52.006719999999994 | 1772.35 |
| 52.016679999999994 | 1771.46 |
| 52.02492999999999 | 1770.85 |
| 52.03164999999999 | 1770.52 |
| 52.03798999999999 | 1770.21 |
| 52.044929999999994 | 1770 |
| 52.113499999999995 | 1768.45 |
| 52.182069999999996 | 1766.91 |
| 52.239039999999996 | 1763.9 |
| 52.296009999999995 | 1758.7 |
| 52.30502 | 1757.87 |
| 52.31236 | 1757.07 |
| 52.3213 | 1756.14 |
| 52.32824 | 1755.41 |
| 52.33617 | 1754.75 |
| 52.381190000000004 | 1751.36 |
| 52.40101000000001 | 1749.87 |
| 52.46363000000001 | 1743.72 |
| 52.52625000000001 | 1736.11 |
| 52.59896000000001 | 1727.27 |
| 52.62202000000001 | 1724.89 |
| 52.658760000000015 | 1722.31 |
| 52.68640000000001 | 1720.38 |
| 52.719920000000016 | 1718.38 |
| 52.77526000000002 | 1714.86 |
| 52.80998000000002 | 1712.66 |
| 52.86543000000002 | 1708.34 |
| 52.90405000000002 | 1704.73 |
| 52.91540000000002 | 1703.66 |
| 52.927030000000016 | 1702.64 |
| 52.959840000000014 | 1699.98 |
| 52.986680000000014 | 1697.81 |
| 53.02529000000001 | 1693.36 |
| 53.041910000000016 | 1690.66 |
| 53.068460000000016 | 1686.34 |
| 53.120950000000015 | 1678.27 |
| 53.13133000000001 | 1677.64 |
| 53.15074000000001 | 1676.44 |
| 53.20052000000001 | 1676.64 |
| 53.226610000000015 | 1676.38 |
| 53.281030000000015 | 1675.82 |
| 53.331260000000015 | 1674.79 |
| 53.36490000000001 | 1674.53 |
| 53.39080000000001 | 1674.33 |
| 53.41430000000001 | 1674.2 |
| 53.42818000000001 | 1673.73 |
| 53.44516000000001 | 1673.16 |
| 53.45924000000001 | 1672.02 |
| 53.466930000000005 | 1671.13 |
| 53.47594000000001 | 1670.09 |
| 53.527460000000005 | 1663.01 |
| 53.54339 | 1660.06 |
| 53.55727 | 1657.49 |
| 53.58392 | 1651.65 |
| 53.62584 | 1643.31 |
| 53.69208999999999 | 1630.14 |
| 53.74251999999999 | 1624.53 |
| 53.76689999999999 | 1624.17 |
| 53.79165999999999 | 1623.81 |
| 53.812239999999996 | 1623.42 |
| 53.844789999999996 | 1621.01 |
| 53.85641999999999 | 1620.15 |
| 53.87277999999999 | 1618.29 |
| 53.88197999999999 | 1617.12 |
| 53.93967999999999 | 1609.76 |
| 54.00030999999999 | 1603.53 |
| 54.03837999999999 | 1601.1 |
| 54.05496999999999 | 1600.04 |
| 54.08957999999999 | 1599.16 |
| 54.111079999999994 | 1599.11 |
| 54.129819999999995 | 1599.07 |
| 54.15423 | 1599.29 |
| 54.16699 | 1599.38 |
| 54.18678 | 1599.53 |
| 54.20086 | 1598.69 |
| 54.23442 | 1594.48 |
| 54.27576 | 1589.29 |
| 54.298829999999995 | 1586.68 |
| 54.32982 | 1584.13 |
| 54.37757 | 1580.21 |
| 54.40202 | 1579.26 |
| 54.42082 | 1579.18 |
| 54.46736 | 1579 |
| 54.49187 | 1579 |
| 54.503499999999995 | 1578.96 |
| 54.525819999999996 | 1578.88 |
| 54.53427 | 1578.59 |
| 54.55714 | 1576.98 |
| 54.56869 | 1576.17 |
| 54.60903999999999 | 1572.28 |
| 54.651089999999996 | 1567.06 |
| 54.717299999999994 | 1558.85 |
| 54.743559999999995 | 1554.92 |
| 54.76161999999999 | 1552.51 |
| 54.785999999999994 | 1549.26 |
| 54.87210999999999 | 1542.96 |
| 54.88660999999999 | 1542.52 |
| 54.95505999999999 | 1540.43 |
| 54.97345999999999 | 1539.83 |
| 55.055379999999985 | 1535.43 |
| 55.09816999999998 | 1533.12 |
| 55.137419999999985 | 1530.3 |
| 55.15054999999998 | 1529.4 |
| 55.198509999999985 | 1526.12 |
| 55.249839999999985 | 1524.98 |
| 55.301169999999985 | 1525.06 |
| 55.363399999999984 | 1525.16 |
| 55.403049999999986 | 1522.7 |
| 55.43888999999999 | 1517.85 |
| 55.459209999999985 | 1515.1 |
| 55.479959999999984 | 1511.98 |
| 55.50134999999998 | 1508.92 |
| 55.53196999999998 | 1504.53 |
| 55.55026999999998 | 1502.5 |
| 55.610469999999985 | 1497.65 |
| 55.66222999999999 | 1493.48 |
| 55.71398999999999 | 1489.36 |
| 55.75792999999999 | 1485.56 |
| 55.78216999999999 | 1483.45 |
| 55.814219999999985 | 1480.44 |
| 55.840699999999984 | 1477.92 |
| 55.90045999999998 | 1472.24 |
| 55.93863999999998 | 1468.62 |
| 55.96081999999998 | 1466.45 |
| 55.98605999999997 | 1463.98 |
| 56.00413999999997 | 1462.28 |
| 56.01752999999997 | 1461.15 |
| 56.03065999999997 | 1460.04 |
| 56.04447999999997 | 1458.91 |
| 56.06307999999997 | 1457.3 |
| 56.08193999999997 | 1455.67 |
| 56.140159999999966 | 1450.63 |
| 56.198379999999965 | 1446 |
| 56.29435999999996 | 1438.36 |
| 56.39033999999996 | 1431.46 |
| 56.43220999999996 | 1428.48 |
| 56.455069999999964 | 1426.85 |
| 56.49299999999997 | 1423.75 |
| 56.503649999999965 | 1422.63 |
| 56.514999999999965 | 1421.42 |
| 56.53296999999996 | 1418.95 |
| 56.54994999999996 | 1416.52 |
| 56.60650999999996 | 1408.41 |
| 56.663069999999955 | 1402.73 |
| 56.72080999999996 | 1399.38 |
| 56.78740999999996 | 1395.51 |
| 56.81857999999996 | 1393.66 |
| 56.88018999999996 | 1389.15 |
| 56.941799999999965 | 1384.64 |
| 56.97180999999996 | 1382.2 |
| 57.03232999999996 | 1377.04 |
| 57.092849999999956 | 1371.89 |
| 57.121789999999955 | 1369.76 |
| 57.148809999999955 | 1368.02 |
| 57.20502999999996 | 1364.38 |
| 57.246589999999955 | 1360.9 |
| 57.32033999999995 | 1352.97 |
| 57.35061999999995 | 1349.72 |
| 57.44264999999995 | 1339.49 |
| 57.48873999999995 | 1335.06 |
| 57.53745999999995 | 1330.39 |
| 57.575769999999956 | 1328.31 |
| 57.599139999999956 | 1327.78 |
| 57.61376999999995 | 1327.45 |
| 57.633789999999955 | 1326.62 |
| 57.657319999999956 | 1324.97 |
| 57.674039999999955 | 1323.8 |
| 57.68228999999995 | 1323.14 |
| 57.69241999999995 | 1322.29 |
| 57.73094999999995 | 1319.05 |
| 57.75766999999995 | 1316.72 |
| 57.77672999999995 | 1315 |
| 57.79688999999995 | 1313.18 |
| 57.85094999999995 | 1308.49 |
| 57.90500999999995 | 1303.95 |
| 57.92482999999995 | 1302.28 |
| 57.94692999999995 | 1300.29 |
| 58.00076999999995 | 1295.45 |
| 58.05110999999995 | 1290.92 |
| 58.119929999999954 | 1285.95 |
| 58.14828999999995 | 1284.24 |
| 58.17240999999996 | 1282.79 |
| 58.202579999999955 | 1280.73 |
| 58.26031999999996 | 1276.25 |
| 58.29110999999996 | 1273.86 |
| 58.31019999999996 | 1272.56 |
| 58.326979999999956 | 1271.66 |
| 58.34207999999995 | 1270.85 |
| 58.35670999999995 | 1270.22 |
| 58.37188999999995 | 1269.7 |
| 58.38637999999995 | 1269.2 |
| 58.40007999999995 | 1268.74 |
| 58.41108999999995 | 1268.22 |
| 58.42464999999995 | 1267.57 |
| 58.45057999999995 | 1265.72 |
| 58.470219999999955 | 1263.94 |
| 58.49268999999995 | 1261.92 |
| 58.52477999999995 | 1258.66 |
| 58.55612999999995 | 1255.36 |
| 58.602089999999954 | 1250.51 |
| 58.65427999999996 | 1245.68 |
| 58.69215999999996 | 1242.95 |
| 58.74257999999996 | 1239.31 |
| 58.792999999999964 | 1236.5 |
| 58.81862999999996 | 1235.22 |
| 58.888209999999965 | 1231.75 |
| 58.907009999999964 | 1230.29 |
| 58.960379999999965 | 1224.68 |
| 59.005019999999966 | 1220 |
| 59.020599999999966 | 1218.57 |
| 59.03515999999997 | 1217.52 |
| 59.07452999999997 | 1214.67 |
| 59.091449999999966 | 1213.73 |
| 59.105189999999965 | 1213.24 |
| 59.133819999999965 | 1212.23 |
| 59.14604999999997 | 1212.04 |
| 59.159249999999965 | 1211.94 |
| 59.19196999999996 | 1211.68 |
| 59.205859999999966 | 1210.74 |
| 59.23888999999996 | 1206.26 |
| 59.259629999999966 | 1203.45 |
| 59.32455999999996 | 1193.91 |
| 59.369809999999966 | 1188.05 |
| 59.39136999999997 | 1185.26 |
| 59.425679999999964 | 1182.74 |
| 59.48341999999997 | 1180.82 |
| 59.56185999999997 | 1178.2 |
| 59.632499999999965 | 1174.59 |
| 59.70364999999997 | 1169.47 |
| 59.77479999999997 | 1164.34 |
| 59.80695999999997 | 1162.02 |
| 59.830659999999966 | 1160.33 |
| 59.87892999999997 | 1156.87 |
| 59.91382999999997 | 1154.25 |
| 59.94883999999997 | 1151.58 |
| 60.01438999999997 | 1146.59 |
| 60.07993999999997 | 1141.87 |
| 60.13584999999997 | 1138.02 |
| 60.183049999999966 | 1134.77 |
| 60.217699999999965 | 1131.73 |
| 60.232919999999964 | 1129.96 |
| 60.26655999999996 | 1126.03 |
| 60.297969999999964 | 1122.03 |
| 60.308109999999964 | 1120.86 |
| 60.31899999999997 | 1119.61 |
| 60.32847999999997 | 1118.88 |
| 60.36566999999997 | 1117.07 |
| 60.38482999999997 | 1116.13 |
| 60.40465999999997 | 1115.35 |
| 60.486219999999975 | 1112.05 |
| 60.516909999999974 | 1110.8 |
| 60.575359999999975 | 1107.2 |
| 60.62360999999998 | 1103.59 |
| 60.701639999999976 | 1097.77 |
| 60.71619999999998 | 1097.14 |
| 60.72865999999998 | 1097.06 |
| 60.73732999999998 | 1097 |
| 60.74817999999998 | 1096.83 |
| 60.78036999999998 | 1095.22 |
| 60.809819999999974 | 1093.74 |
| 60.88545999999997 | 1086.93 |
| 60.96109999999997 | 1078.15 |
| 61.03673999999997 | 1069.38 |
| 61.05503999999998 | 1066.84 |
| 61.079279999999976 | 1063.29 |
| 61.096019999999974 | 1060.84 |
| 61.113149999999976 | 1059.61 |
| 61.133199999999974 | 1059.93 |
| 61.149969999999975 | 1060.19 |
| 61.167539999999974 | 1060.94 |
| 61.19806999999997 | 1062.04 |
| 61.21663999999997 | 1062.71 |
| 61.23649999999997 | 1062.17 |
| 61.28770999999997 | 1057.66 |
| 61.30216999999997 | 1056.39 |
| 61.35023999999997 | 1051.9 |
| 61.39747999999997 | 1047.88 |
| 61.496829999999974 | 1039.44 |
| 61.596179999999976 | 1030.46 |
| 61.685089999999974 | 1020.89 |
| 61.779339999999976 | 1010.75 |
| 61.80920999999998 | 1007.43 |
| 61.83070999999998 | 1005.81 |
| 61.839539999999985 | 1005.14 |
| 61.889439999999986 | 1003.31 |
| 61.93033999999999 | 1002.04 |
| 61.96991999999999 | 1000.81 |
| 61.98838999999999 | 1000.19 |
| 62.01881999999999 | 999.26 |
| 62.04657999999999 | 998.42 |
| 62.100829999999995 | 997.41 |
| 62.115959999999994 | 997.44 |
| 62.13587 | 997.47 |
| 62.17164 | 998.39 |
| 62.19340999999999 | 999.4 |
| 62.21479999999999 | 1000.4 |
| 62.24140999999999 | 1002.08 |
| 62.27648999999999 | 1004.67 |
| 62.29282999999999 | 1005.88 |
| 62.31265999999999 | 1007.59 |
| 62.377209999999984 | 1013.63 |
| 62.43515999999998 | 1019.05 |
| 62.456499999999984 | 1020.13 |
| 62.519759999999984 | 1020.73 |
| 62.55711999999998 | 1021.09 |
| 62.58956999999998 | 1022.74 |
| 62.61450999999998 | 1025.37 |
| 62.67608999999998 | 1031.86 |
| 62.68846999999998 | 1033.48 |
| 62.70216999999998 | 1035.2 |
| 62.71657999999998 | 1037.01 |
| 62.72917999999998 | 1037.75 |
| 62.773719999999976 | 1037.93 |
| 62.78254999999998 | 1037.96 |
| 62.79524999999998 | 1037.87 |
| 62.83269999999998 | 1037.3 |
| 62.85075999999998 | 1037.02 |
| 62.93026999999998 | 1035.46 |
| 63.00977999999998 | 1033.63 |
| 63.02817999999998 | 1033.21 |
| 63.07155999999998 | 1032.54 |
| 63.09613999999998 | 1032.59 |
| 63.13070999999998 | 1032.66 |
| 63.15396999999998 | 1033.42 |
| 63.20886999999998 | 1036.36 |
| 63.22651999999999 | 1037.31 |
| 63.24349999999998 | 1037.83 |
| 63.25680999999998 | 1037.84 |
| 63.28331999999998 | 1037.86 |
| 63.29532999999998 | 1037.45 |
| 63.33258999999998 | 1034.97 |
| 63.34908999999998 | 1033.87 |
| 63.36215999999998 | 1032.74 |
| 63.402419999999985 | 1028.85 |
| 63.41413999999998 | 1027.72 |
| 63.42426999999998 | 1027.17 |
| 63.43581999999998 | 1027.07 |
| 63.44723999999998 | 1026.98 |
| 63.45568999999998 | 1026.88 |
| 63.47092999999998 | 1026.54 |
| 63.50925999999998 | 1025.67 |
| 63.52908999999998 | 1025.01 |
| 63.54662999999998 | 1024.3 |
| 63.57574999999998 | 1023.11 |
| 63.62917999999998 | 1021 |
| 63.66389999999998 | 1019.7 |
| 63.70661999999998 | 1018.09 |
| 63.73640999999998 | 1017.05 |
| 63.75088999999998 | 1016.58 |
| 63.770339999999976 | 1015.94 |
| 63.824259999999974 | 1014.41 |
| 63.85090999999997 | 1013.84 |
| 63.88189999999997 | 1013.18 |
| 63.95627999999997 | 1011.96 |
| 64.01442999999998 | 1010.79 |
| 64.03712999999998 | 1010.33 |
| 64.09476999999998 | 1008.37 |
| 64.13813999999998 | 1006.43 |
| 64.18239999999997 | 1004.45 |
| 64.23508999999997 | 1002.44 |
| 64.26838999999997 | 1001.56 |
| 64.30909999999997 | 1000.48 |
| 64.37241999999998 | 998.74 |
| 64.45919999999998 | 995.75 |
| 64.51077999999998 | 993.97 |
| 64.53275999999998 | 993.18 |
| 64.62085999999998 | 989.86 |
| 64.69899999999998 | 986.92 |
| 64.72151999999998 | 985.06 |
| 64.74350999999999 | 982.16 |
| 64.76687999999999 | 979.09 |
| 64.77925999999998 | 977.75 |
| 64.79148999999998 | 976.91 |
| 64.87632999999998 | 971.09 |
| 64.91285999999998 | 969.61 |
| 64.95357999999997 | 968.7 |
| 65.00849999999997 | 967.48 |
| 65.04414999999997 | 966.19 |
| 65.10840999999998 | 962.96 |
| 65.13109999999998 | 961.83 |
| 65.21255999999998 | 955.78 |
| 65.24532999999998 | 951.92 |
| 65.29246999999998 | 946.38 |
| 65.31718999999998 | 943.58 |
| 65.33700999999998 | 942.04 |
| 65.38870999999997 | 938.03 |
| 65.41992999999998 | 935.98 |
| 65.51446999999997 | 929.78 |
| 65.58229999999998 | 925.34 |
| 65.63324999999998 | 921.4 |
| 65.64549999999997 | 920.27 |
| 65.65469999999998 | 919.42 |
| 65.66262999999998 | 918.62 |
| 65.66956999999998 | 917.84 |
| 65.67859999999997 | 916.84 |
| 65.69086999999998 | 915.45 |
| 65.69855999999997 | 914.63 |
| 65.70812999999997 | 913.6 |
| 65.75860999999996 | 908.58 |
| 65.80908999999996 | 904.1 |
| 65.87319999999995 | 898.41 |
| 65.91568999999996 | 896.05 |
| 65.93278999999995 | 895.6 |
| 65.97676999999996 | 894.45 |
| 66.02085999999996 | 892.72 |
| 66.08247999999996 | 889.14 |
| 66.12565999999997 | 886.63 |
| 66.14084999999997 | 885.87 |
| 66.15260999999997 | 885.4 |
| 66.16826999999996 | 884.78 |
| 66.18174999999997 | 884.15 |
| 66.19760999999997 | 883.2 |
| 66.21223999999997 | 882.32 |
| 66.22733999999997 | 881.07 |
| 66.27908999999997 | 876.35 |
| 66.29872999999996 | 874.56 |
| 66.35619999999996 | 870.76 |
| 66.41604999999996 | 868.16 |
| 66.42746999999996 | 867.66 |
| 66.43571999999996 | 867.36 |
| 66.44584999999996 | 866.99 |
| 66.45528999999996 | 866.65 |
| 66.46500999999996 | 866.24 |
| 66.50775999999996 | 864.16 |
| 66.51747999999996 | 863.68 |
| 66.52650999999996 | 863.18 |
| 66.53655999999997 | 862.55 |
| 66.54725999999997 | 861.89 |
| 66.55948999999997 | 861.16 |
| 66.63933999999996 | 856.28 |
| 66.71918999999995 | 851.41 |
| 66.78968999999995 | 845.63 |
| 66.84890999999995 | 839.54 |
| 66.90812999999994 | 833.46 |
| 66.94658999999994 | 829.76 |
| 66.99073999999995 | 825.86 |
| 67.02060999999995 | 823.22 |
| 67.05159999999995 | 820.17 |
| 67.09977999999995 | 815.34 |
| 67.13122999999996 | 812.18 |
| 67.16474999999996 | 810.02 |
| 67.25697999999996 | 806.52 |
| 67.29852999999996 | 804.94 |
| 67.36516999999996 | 800.91 |
| 67.43180999999997 | 795.21 |
| 67.46761999999997 | 792.15 |
| 67.50797999999998 | 789.04 |
| 67.58161999999997 | 784.53 |
| 67.62252999999997 | 782.03 |
| 67.64203999999997 | 780.89 |
| 67.65824999999997 | 779.92 |
| 67.67270999999997 | 779.06 |
| 67.72323999999996 | 776.1 |
| 67.74001999999996 | 775.15 |
| 67.75874999999996 | 774.09 |
| 67.78387999999997 | 772.57 |
| 67.81921999999997 | 770.27 |
| 67.83498999999998 | 769.24 |
| 67.89278999999998 | 765.94 |
| 67.94941999999998 | 763.43 |
| 67.97906999999998 | 762.11 |
| 68.01091999999998 | 760.86 |
| 68.10596999999999 | 757.07 |
| 68.14384999999999 | 755.55 |
| 68.24287999999999 | 751.42 |
| 68.28566999999998 | 749.68 |
| 68.30970999999998 | 748.7 |
| 68.40906999999999 | 745.16 |
| 68.47694999999999 | 742.97 |
| 68.50339999999998 | 742.11 |
| 68.52552999999999 | 741.1 |
| 68.56920999999998 | 738.47 |
| 68.59020999999998 | 737.21 |
| 68.64488999999999 | 733.72 |
| 68.67723 | 731.27 |
| 68.71834 | 728.15 |
| 68.78108999999999 | 722.96 |
| 68.8595 | 717.47 |
| 68.89604 | 714.92 |
| 68.94161 | 713.07 |
| 68.94161 | 713.07 |
| 68.98303 | 711.94 |
| 69.10356 | 707.74 |
| 69.15614000000001 | 705.86 |
| 69.19028 | 704.63 |
| 69.26085 | 702.14 |
| 69.28599 | 701.23 |
| 69.35132 | 698.86 |
| 69.37138 | 698.12 |
| 69.51978 | 692.8 |
| 69.69497 | 686.53 |
| 69.73192 | 686.08 |
| 69.83134 | 687.51 |
| 69.87383 | 688.12 |
| 69.90274 | 688.39 |
| 69.99467 | 687.93 |
| 70.0288 | 687.76 |
| 70.04963000000001 | 686.86 |
| 70.06727000000001 | 685.44 |
| 70.08491000000001 | 684.02 |
| 70.10853 | 682.02 |
| 70.18306 | 676.08 |
| 70.21683999999999 | 673.39 |
| 70.27476999999999 | 670.03 |
| 70.29782999999999 | 669.21 |
| 70.35538999999999 | 667.17 |
| 70.45725999999999 | 663.33 |
| 70.50228999999999 | 661 |
| 70.53344999999999 | 659.39 |
| 70.56927999999999 | 657.76 |
| 70.60811 | 656.8 |
| 70.65411 | 655.65 |
| 70.76251 | 654.23 |
| 70.91414 | 652.71 |
| 70.94733000000001 | 652.38 |
| 70.96407 | 651.79 |
| 70.98639 | 650.35 |
| 71.03073 | 647.49 |
| 71.06018 | 645.34 |
| 71.21247 | 633.61 |
| 71.25153 | 630.6 |
| 71.28285 | 627.95 |
| 71.30995999999999 | 625.39 |
| 71.33948999999998 | 622.6 |
| 71.35218999999998 | 621.37 |
| 71.36359999999998 | 620.32 |
| 71.37695999999998 | 619.08 |
| 71.39026999999999 | 617.94 |
| 71.40099 | 617.04 |
| 71.42676999999999 | 614.88 |
| 71.43445999999999 | 614.32 |
| 71.44534999999999 | 613.67 |
| 71.45943 | 612.83 |
| 71.47084 | 612.14 |
| 71.48286 | 611.27 |
| 71.49606 | 610.32 |
| 71.55799 | 605.17 |
| 71.58502 | 602.93 |
| 71.60418 | 601.35 |
| 71.62473 | 599.7 |
| 71.63767 | 598.61 |
| 71.64687 | 597.82 |
| 71.66385000000001 | 596.28 |
| 71.68228 | 594.55 |
| 71.71463 | 591.52 |
| 71.72794 | 590.08 |
| 71.7425 | 588.25 |
| 71.75338 | 586.88 |
| 71.76876 | 584.69 |
| 71.78316 | 582.56 |
| 71.83072999999999 | 575.49 |
| 71.86313999999999 | 571.97 |
| 71.89974 | 569.53 |
| 72.03899 | 560.22 |
| 72.06694 | 559.15 |
| 72.0871 | 558.79 |
| 72.10532 | 558.47 |
| 72.12369000000001 | 557.77 |
| 72.14481 | 556.53 |
| 72.20089 | 553.24 |
| 72.2424 | 550.73 |
| 72.25750000000001 | 549.82 |
| 72.26670000000001 | 549.27 |
| 72.27552000000001 | 548.75 |
| 72.28406000000001 | 548.27 |
| 72.33558000000001 | 545.35 |
| 72.34804000000001 | 544.63 |
| 72.35940000000001 | 543.97 |
| 72.37075 | 543.32 |
| 72.38080000000001 | 542.73 |
| 72.41354000000001 | 540.79 |
| 72.42931000000002 | 539.85 |
| 72.44010000000002 | 539.21 |
| 72.45186000000001 | 538.53 |
| 72.46413000000001 | 537.82 |
| 72.47659000000002 | 537.03 |
| 72.48526000000001 | 536.44 |
| 72.49296000000001 | 535.9 |
| 72.50365000000001 | 535.18 |
| 72.51305 | 534.59 |
| 72.52452000000001 | 533.86 |
| 72.53615 | 533.16 |
| 72.57079 | 531.15 |
| 72.58995 | 530.03 |
| 72.6076 | 529.08 |
| 72.62567 | 528.12 |
| 72.65087 | 526.79 |
| 72.68393 | 524.78 |
| 72.71289 | 522.73 |
| 72.72798 | 521.66 |
| 72.77947 | 518.22 |
| 72.79457000000001 | 517.43 |
| 72.85363000000001 | 514.34 |
| 72.88835 | 513.07 |
| 72.92413 | 512.12 |
| 72.95833 | 511.22 |
| 73.05196000000001 | 509.06 |
| 73.07279000000001 | 508.64 |
| 73.09801000000002 | 508.13 |
| 73.11415000000001 | 507.78 |
| 73.13093 | 507.3 |
| 73.14543 | 506.88 |
| 73.17318 | 505.79 |
| 73.24658000000001 | 502.61 |
| 73.27615000000002 | 501.33 |
| 73.49282000000001 | 493.49 |
| 73.57695000000001 | 491.66 |
| 73.6209 | 490.71 |
| 73.63253 | 490.77 |
| 73.63587 | 490.86 |
| 73.64220999999999 | 491.02 |
| 73.6454 | 491.16 |
| 73.65234 | 491.62 |
| 73.65558 | 491.84 |
| 73.65877 | 491.99 |
| 73.66611 | 492.22 |
| 73.66945 | 492.33 |
| 73.67618999999999 | 492.5 |
| 73.68266999999999 | 492.58 |
| 73.71273 | 492.98 |
| 73.71744 | 492.98 |
| 73.71744 | 492.98 |
| 73.7461 | 492.69 |
| 73.78249 | 492.15 |
| 73.80685 | 491.78 |
| 73.84027999999999 | 491.27 |
| 73.89043 | 490.64 |
| 73.945 | 490.23 |
| 74.02922 | 489.59 |
| 74.10817 | 489.62 |
| 74.12403 | 489.6 |
| 74.14773000000001 | 489.57 |
| 74.19645000000001 | 489 |